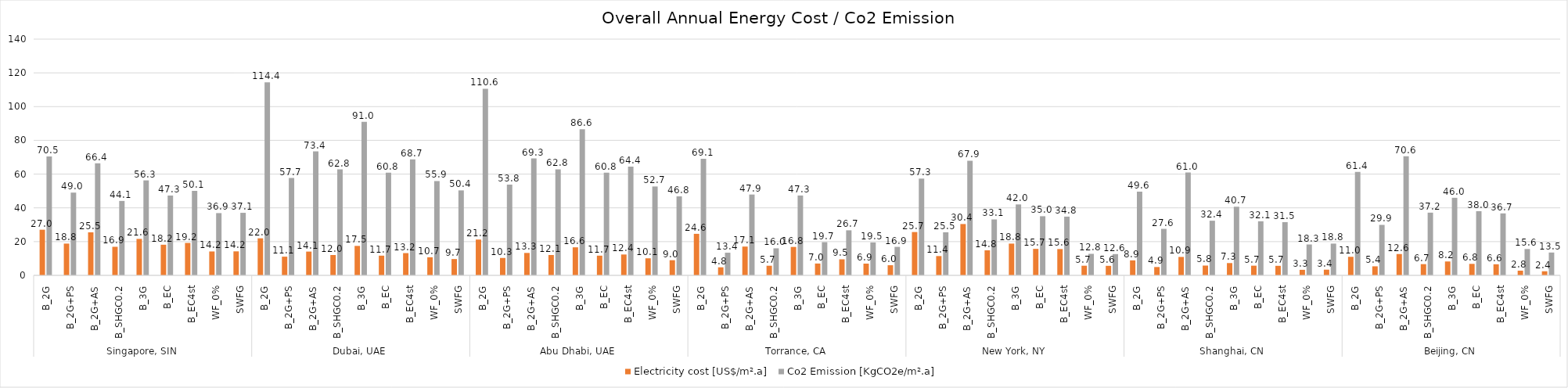
| Category | Electricity cost | Co2 Emission |
|---|---|---|
| 0 | 27.045 | 70.468 |
| 1 | 18.824 | 49.048 |
| 2 | 25.498 | 66.436 |
| 3 | 16.926 | 44.103 |
| 4 | 21.601 | 56.281 |
| 5 | 18.155 | 47.303 |
| 6 | 19.215 | 50.065 |
| 7 | 14.158 | 36.89 |
| 8 | 14.224 | 37.061 |
| 9 | 21.955 | 114.412 |
| 10 | 11.075 | 57.712 |
| 11 | 14.09 | 73.425 |
| 12 | 12.047 | 62.778 |
| 13 | 17.455 | 90.958 |
| 14 | 11.672 | 60.827 |
| 15 | 13.182 | 68.693 |
| 16 | 10.722 | 55.875 |
| 17 | 9.662 | 50.352 |
| 18 | 21.222 | 110.59 |
| 19 | 10.317 | 53.765 |
| 20 | 13.29 | 69.257 |
| 21 | 12.059 | 62.843 |
| 22 | 16.619 | 86.606 |
| 23 | 11.672 | 60.825 |
| 24 | 12.363 | 64.424 |
| 25 | 10.106 | 52.666 |
| 26 | 8.985 | 46.823 |
| 27 | 24.607 | 69.105 |
| 28 | 4.778 | 13.418 |
| 29 | 17.056 | 47.9 |
| 30 | 5.706 | 16.026 |
| 31 | 16.849 | 47.319 |
| 32 | 7.007 | 19.677 |
| 33 | 9.509 | 26.705 |
| 34 | 6.946 | 19.507 |
| 35 | 6.007 | 16.871 |
| 36 | 25.673 | 57.336 |
| 37 | 11.432 | 25.531 |
| 38 | 30.417 | 67.931 |
| 39 | 14.842 | 33.148 |
| 40 | 18.821 | 42.035 |
| 41 | 15.693 | 35.047 |
| 42 | 15.582 | 34.799 |
| 43 | 5.71 | 12.751 |
| 44 | 5.645 | 12.608 |
| 45 | 8.884 | 49.604 |
| 46 | 4.936 | 27.561 |
| 47 | 10.917 | 60.954 |
| 48 | 5.8 | 32.386 |
| 49 | 7.284 | 40.669 |
| 50 | 5.74 | 32.05 |
| 51 | 5.65 | 31.547 |
| 52 | 3.279 | 18.308 |
| 53 | 3.371 | 18.821 |
| 54 | 10.991 | 61.366 |
| 55 | 5.357 | 29.91 |
| 56 | 12.639 | 70.57 |
| 57 | 6.655 | 37.16 |
| 58 | 8.23 | 45.953 |
| 59 | 6.813 | 38.04 |
| 60 | 6.577 | 36.721 |
| 61 | 2.795 | 15.608 |
| 62 | 2.423 | 13.527 |